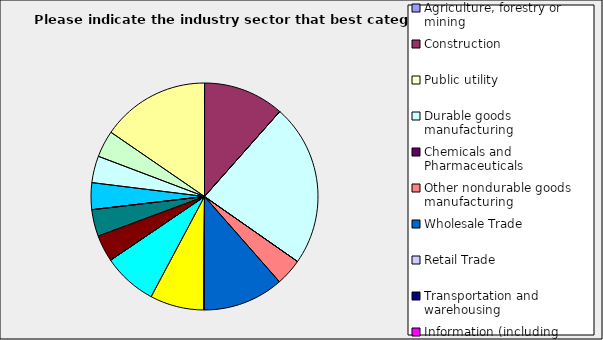
| Category | Series 0 |
|---|---|
| Agriculture, forestry or mining | 0 |
| Construction | 0.115 |
| Public utility | 0 |
| Durable goods manufacturing | 0.231 |
| Chemicals and Pharmaceuticals | 0 |
| Other nondurable goods manufacturing | 0.038 |
| Wholesale Trade | 0.115 |
| Retail Trade | 0 |
| Transportation and warehousing | 0 |
| Information (including broadcasting and telecommunication) | 0 |
| Finance and Insurance | 0.077 |
| Real Estate | 0.077 |
| Professional, scientific and technical services | 0 |
| Consulting | 0.038 |
| Administrative and office services (including waste management) | 0.038 |
| Education | 0 |
| Health Care and social services | 0.038 |
| Arts, entertainment and recreation | 0.038 |
| Accommodation and food services | 0.038 |
| Other | 0.154 |